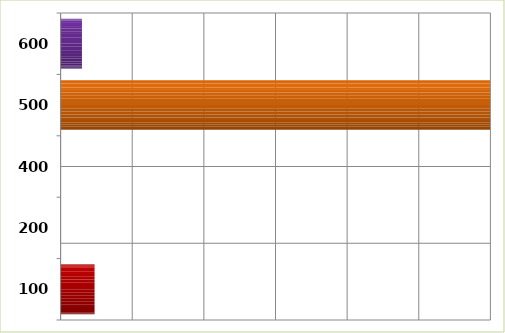
| Category | Series 0 |
|---|---|
| 100.0 | 4739814 |
| 200.0 | 0 |
| 400.0 | 0 |
| 500.0 | 59947563 |
| 600.0 | 2981326 |